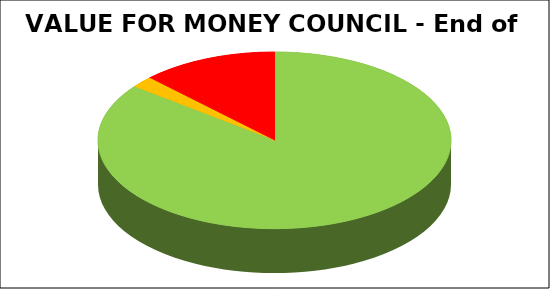
| Category | Series 0 |
|---|---|
| Green | 0.854 |
| Amber | 0.021 |
| Red | 0.125 |